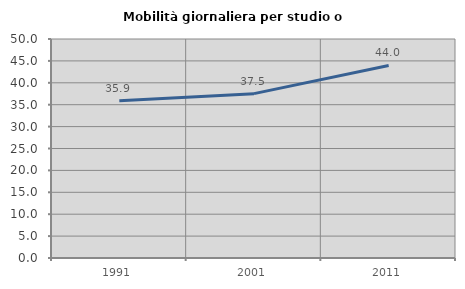
| Category | Mobilità giornaliera per studio o lavoro |
|---|---|
| 1991.0 | 35.893 |
| 2001.0 | 37.527 |
| 2011.0 | 43.956 |